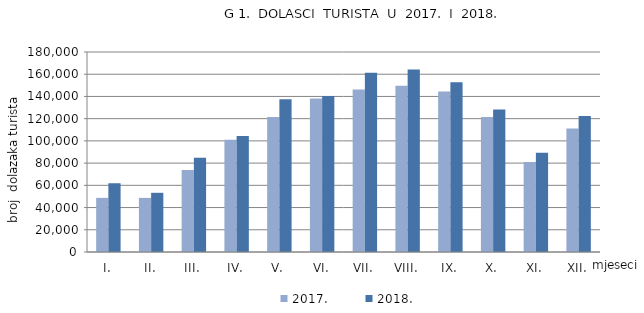
| Category | 2017. | 2018. |
|---|---|---|
| I. | 48720 | 61823 |
| II. | 48696 | 53284 |
| III. | 73742 | 84821 |
| IV. | 101117 | 104438 |
| V. | 121570 | 137438 |
| VI. | 138169 | 140371 |
| VII. | 146192 | 161231 |
| VIII. | 149702 | 164189 |
| IX. | 144432 | 152689 |
| X. | 121462 | 128274 |
| XI. | 81032 | 89281 |
| XII. | 111253 | 122362 |